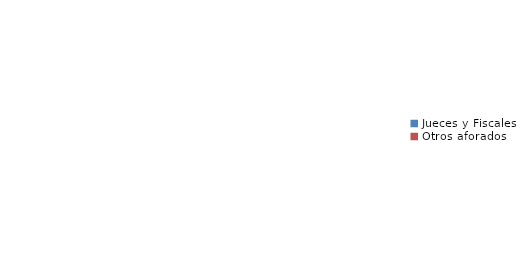
| Category | Series 0 |
|---|---|
| Jueces y Fiscales | 0 |
| Otros aforados | 0 |